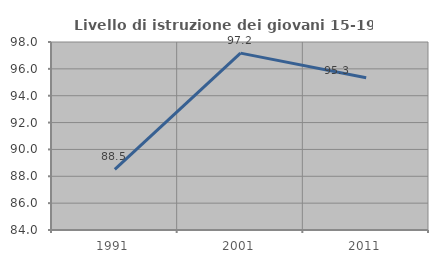
| Category | Livello di istruzione dei giovani 15-19 anni |
|---|---|
| 1991.0 | 88.519 |
| 2001.0 | 97.17 |
| 2011.0 | 95.331 |